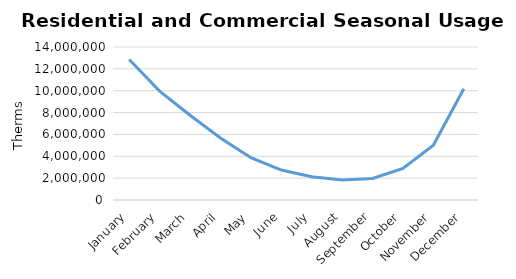
| Category | Series 0 |
|---|---|
| January | 12860032.68 |
| February | 9959166.4 |
| March | 7751649.56 |
| April | 5669215.44 |
| May | 3868085.16 |
| June | 2742513.78 |
| July | 2121194.68 |
| August | 1830821.96 |
| September | 1974755.36 |
| October | 2893013.3 |
| November | 5004152.58 |
| December | 10187454.46 |